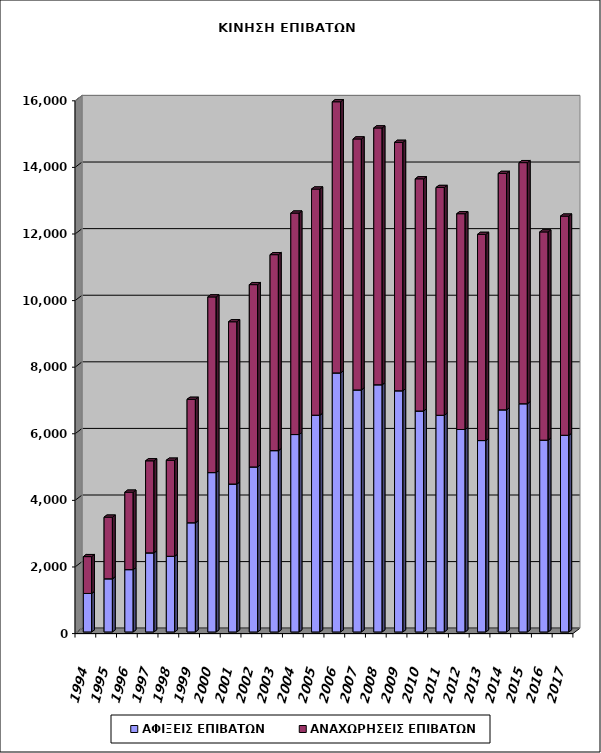
| Category | ΑΦΙΞΕΙΣ ΕΠΙΒΑΤΩΝ | ΑΝΑΧΩΡΗΣΕΙΣ ΕΠΙΒΑΤΩΝ |
|---|---|---|
| 1994.0 | 1156 | 1107 |
| 1995.0 | 1597 | 1851 |
| 1996.0 | 1872 | 2326 |
| 1997.0 | 2375 | 2765 |
| 1998.0 | 2273 | 2885 |
| 1999.0 | 3280 | 3707 |
| 2000.0 | 4786 | 5276 |
| 2001.0 | 4443 | 4873 |
| 2002.0 | 4956 | 5475 |
| 2003.0 | 5446 | 5885 |
| 2004.0 | 5929 | 6651 |
| 2005.0 | 6510 | 6792 |
| 2006.0 | 7780 | 8143 |
| 2007.0 | 7269 | 7537 |
| 2008.0 | 7424 | 7713 |
| 2009.0 | 7243 | 7461 |
| 2010.0 | 6636 | 6973 |
| 2011.0 | 6508 | 6841 |
| 2012.0 | 6080 | 6481 |
| 2013.0 | 5748 | 6192 |
| 2014.0 | 6671 | 7100 |
| 2015.0 | 6854 | 7241 |
| 2016.0 | 5761 | 6253 |
| 2017.0 | 5907 | 6582 |